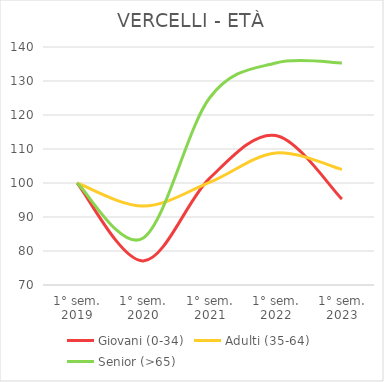
| Category | Giovani (0-34) | Adulti (35-64) | Senior (>65) |
|---|---|---|---|
| 1° sem.
2019 | 100 | 100 | 100 |
| 1° sem.
2020 | 77.095 | 93.209 | 83.824 |
| 1° sem.
2021 | 101.371 | 100.166 | 125 |
| 1° sem.
2022 | 113.966 | 108.82 | 135.294 |
| 1° sem.
2023 | 95.277 | 103.975 | 135.294 |